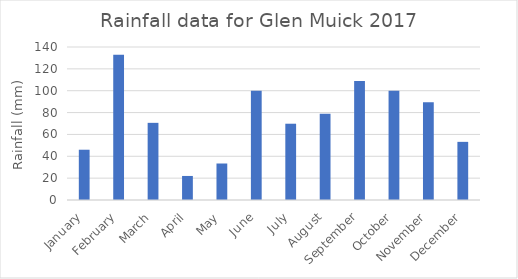
| Category | Rainfall (mm) |
|---|---|
| January | 46 |
| February | 133 |
| March | 70.6 |
| April | 22 |
| May | 33.4 |
| June | 100 |
| July | 69.8 |
| August | 79 |
| September | 109 |
| October | 100 |
| November | 89.4 |
| December | 53.2 |